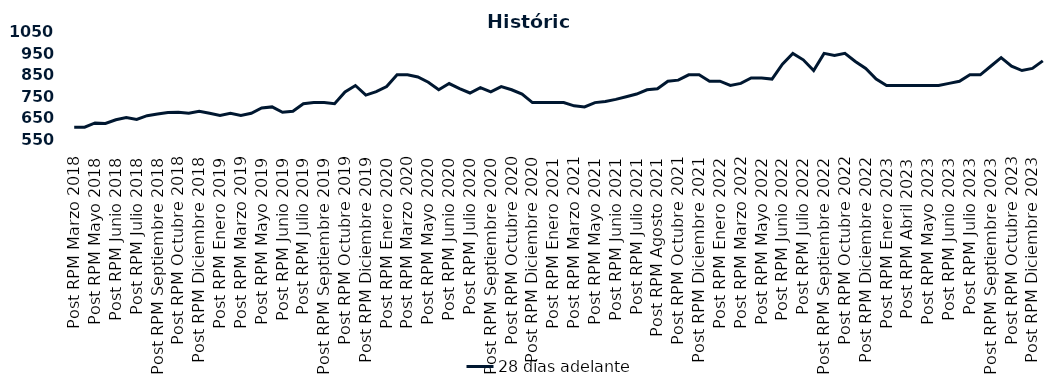
| Category | 28 días adelante |
|---|---|
| Post RPM Marzo 2018 | 605 |
| Pre RPM Mayo 2018 | 605 |
| Post RPM Mayo 2018 | 625 |
| Pre RPM Junio 2018 | 623 |
| Post RPM Junio 2018 | 640 |
| Pre RPM Julio 2018 | 650 |
| Post RPM Julio 2018 | 641 |
| Pre RPM Septiembre 2018 | 659 |
| Post RPM Septiembre 2018 | 666.75 |
| Pre RPM Octubre 2018 | 674 |
| Post RPM Octubre 2018 | 675 |
| Pre RPM Diciembre 2018 | 670 |
| Post RPM Diciembre 2018 | 680 |
| Pre RPM Enero 2019 | 670 |
| Post RPM Enero 2019 | 660 |
| Pre RPM Marzo 2019 | 670 |
| Post RPM Marzo 2019 | 660 |
| Pre RPM Mayo 2019 | 670 |
| Post RPM Mayo 2019 | 695 |
| Pre RPM Junio 2019 | 700 |
| Post RPM Junio 2019 | 675 |
| Pre RPM Julio 2019 | 680 |
| Post RPM Julio 2019 | 715 |
| Pre RPM Septiembre 2019 | 720 |
| Post RPM Septiembre 2019 | 720 |
| Pre RPM Octubre 2019 | 715 |
| Post RPM Octubre 2019 | 770 |
| Pre RPM Diciembre 2019 | 800 |
| Post RPM Diciembre 2019 | 755 |
| Pre RPM Enero 2020 | 771 |
| Post RPM Enero 2020 | 795 |
| Pre RPM Marzo 2020 | 850 |
| Post RPM Marzo 2020 | 850 |
| Pre RPM Mayo 2020 | 840 |
| Post RPM Mayo 2020 | 815 |
| Pre RPM Junio 2020 | 780 |
| Post RPM Junio 2020 | 809 |
| Pre RPM Julio 2020 | 785.72 |
| Post RPM Julio 2020 | 765 |
| Pre RPM Septiembre 2020 | 790 |
| Post RPM Septiembre 2020 | 770 |
| Pre RPM Octubre 2020 | 795 |
| Post RPM Octubre 2020 | 780 |
| Pre RPM Diciembre 2020 | 760 |
| Post RPM Diciembre 2020 | 720 |
| Pre RPM Enero 2021 | 720 |
| Post RPM Enero 2021 | 720 |
| Pre RPM Marzo 2021 | 720 |
| Post RPM Marzo 2021 | 705 |
| Pre RPM Mayo 2021 | 700 |
| Post RPM Mayo 2021 | 720 |
| Pre RPM Junio 2021 | 725 |
| Post RPM Junio 2021 | 735 |
| Pre RPM Julio 2021 | 747.5 |
| Post RPM Julio 2021 | 760 |
| Pre RPM Agosto 2021 | 780 |
| Post RPM Agosto 2021 | 785 |
| Pre RPM Octubre 2021 | 820 |
| Post RPM Octubre 2021 | 825 |
| Pre RPM Diciembre 2021 | 850 |
| Post RPM Diciembre 2021 | 850 |
| Pre RPM Enero 2022 | 820 |
| Post RPM Enero 2022 | 820 |
| Pre RPM Marzo 2022 | 800 |
| Post RPM Marzo 2022 | 810 |
| Pre RPM Mayo 2022 | 835 |
| Post RPM Mayo 2022 | 835 |
| Pre RPM Junio 2022 | 830 |
| Post RPM Junio 2022 | 900 |
| Pre RPM Julio 2022 | 950 |
| Post RPM Julio 2022 | 920 |
| Pre RPM Septiembre 2022 | 870 |
| Post RPM Septiembre 2022 | 950 |
| Pre RPM Octubre 2022 | 940 |
| Post RPM Octubre 2022 | 950 |
| Pre RPM Diciembre 2022 | 912.5 |
| Post RPM Diciembre 2022 | 880 |
| Pre RPM Enero 2023 | 830 |
| Post RPM Enero 2023 | 800 |
| Pre RPM Abril 2023 | 800 |
| Post RPM Abril 2023 | 800 |
| Pre RPM Mayo 2023 | 800 |
| Post RPM Mayo 2023 | 800 |
| Pre RPM Junio 2023 | 800 |
| Post RPM Junio 2023 | 810 |
| Pre RPM Julio 2023 | 820 |
| Post RPM Julio 2023 | 850 |
| Pre RPM Septiembre 2023 | 850 |
| Post RPM Septiembre 2023 | 890 |
| Pre RPM Octubre 2023 | 930 |
| Post RPM Octubre 2023 | 890 |
| Pre RPM Diciembre 2023 | 870 |
| Post RPM Diciembre 2023 | 880 |
| Pre RPM Enero 2024 | 915 |